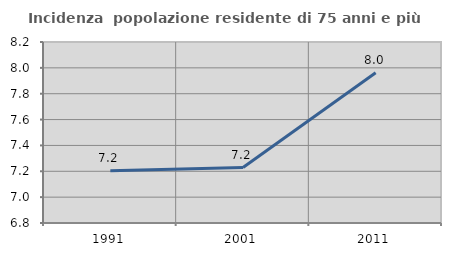
| Category | Incidenza  popolazione residente di 75 anni e più |
|---|---|
| 1991.0 | 7.205 |
| 2001.0 | 7.229 |
| 2011.0 | 7.962 |